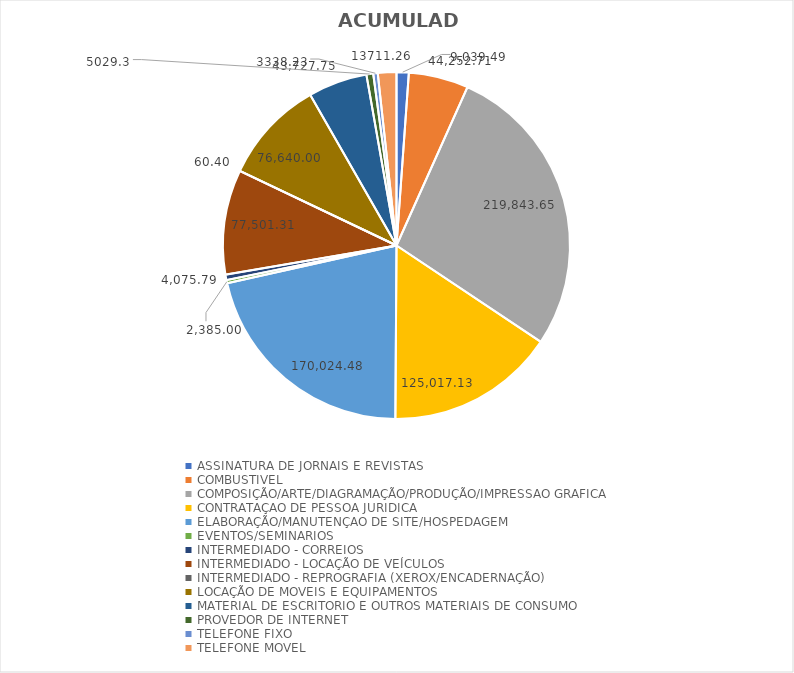
| Category | ACUMULADO |
|---|---|
| ASSINATURA DE JORNAIS E REVISTAS | 9039.49 |
| COMBUSTIVEL | 44252.71 |
| COMPOSIÇÃO/ARTE/DIAGRAMAÇÃO/PRODUÇÃO/IMPRESSAO GRAFICA | 219843.65 |
| CONTRATAÇAO DE PESSOA JURIDICA | 125017.13 |
| ELABORAÇÃO/MANUTENÇAO DE SITE/HOSPEDAGEM | 170024.48 |
| EVENTOS/SEMINARIOS | 2385 |
| INTERMEDIADO - CORREIOS | 4075.79 |
| INTERMEDIADO - LOCAÇÃO DE VEÍCULOS | 77501.31 |
| INTERMEDIADO - REPROGRAFIA (XEROX/ENCADERNAÇÃO) | 60.4 |
| LOCAÇÃO DE MOVEIS E EQUIPAMENTOS | 76640 |
| MATERIAL DE ESCRITORIO E OUTROS MATERIAIS DE CONSUMO | 43727.75 |
| PROVEDOR DE INTERNET | 5029.3 |
| TELEFONE FIXO | 3338.23 |
| TELEFONE MOVEL | 13711.26 |